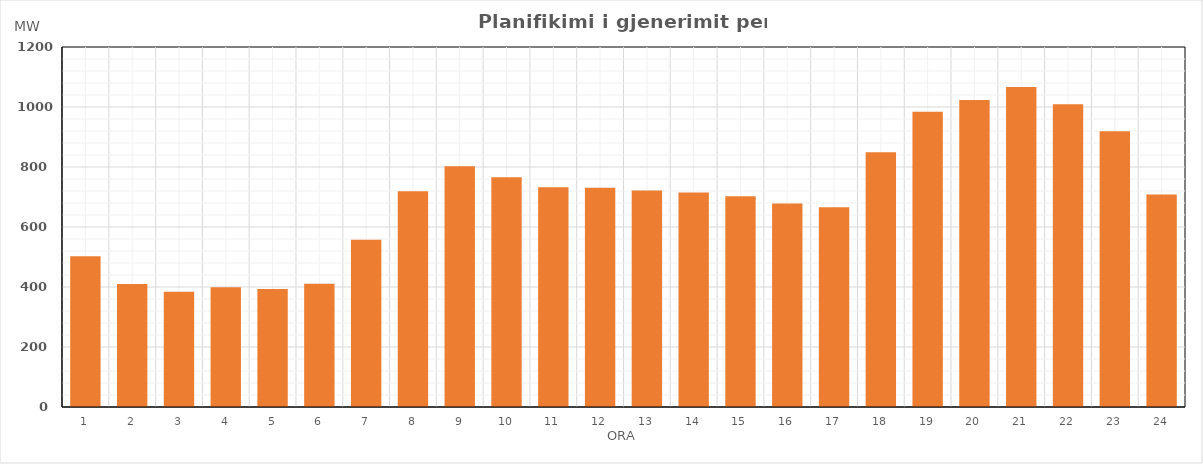
| Category | Max (MW) |
|---|---|
| 0 | 502.449 |
| 1 | 409.937 |
| 2 | 384.033 |
| 3 | 399.122 |
| 4 | 392.97 |
| 5 | 411.156 |
| 6 | 557.861 |
| 7 | 718.752 |
| 8 | 802.186 |
| 9 | 766.031 |
| 10 | 732.522 |
| 11 | 730.681 |
| 12 | 721.728 |
| 13 | 715.355 |
| 14 | 702.103 |
| 15 | 678.43 |
| 16 | 666.229 |
| 17 | 848.959 |
| 18 | 984.008 |
| 19 | 1023.074 |
| 20 | 1066.923 |
| 21 | 1009.201 |
| 22 | 919.037 |
| 23 | 707.975 |